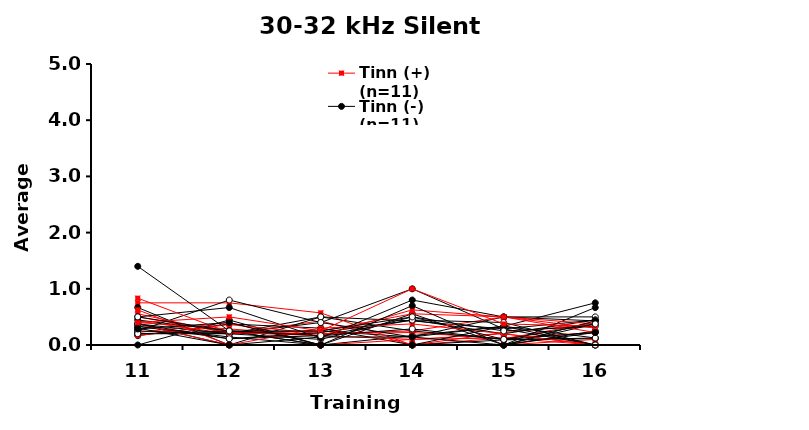
| Category | Tinn (+) (n=11) | Tinn (-) (n=11) | Ctrl (n=8) | CI03 | CI04 | CI05 | CI06 | CI07 | CI08 | CI09 | CI10 | DS18 | CI11 | CI12 | DS19 | CI13 | CI14 | DS20 | CI15 | CI16 | DS21 | CI17 | CI18 | DS22 | CI19 | CI20 | DS23 | CI21 | CI22 | DS24 |
|---|---|---|---|---|---|---|---|---|---|---|---|---|---|---|---|---|---|---|---|---|---|---|---|---|---|---|---|---|---|---|
| 11.0 | 0.556 | 0.333 | 0.2 | 0.167 | 0.2 | 0.75 | 0.222 | 0.4 | 0 | 0.5 | 0.667 | 0.333 | 0.375 | 0.429 | 0.375 | 0.444 | 0.375 | 0.25 | 0.625 | 0.167 | 0.25 | 1.4 | 0.5 | 0.375 | 0.3 | 0.833 | 0.2 | 0.286 | 0.4 | 0.5 |
| 12.0 | 0.2 | 0.143 | 0.222 | 0.375 | 0.2 | 0.75 | 0.4 | 0.286 | 0.444 | 0.222 | 0 | 0.111 | 0 | 0.2 | 0.2 | 0.25 | 0 | 0.2 | 0 | 0.364 | 0.8 | 0.25 | 0.667 | 0.111 | 0 | 0.222 | 0.25 | 0.4 | 0.5 | 0.25 |
| 13.0 | 0.429 | 0 | 0.25 | 0.3 | 0.4 | 0.571 | 0 | 0.167 | 0 | 0.2 | 0.5 | 0.167 | 0 | 0.25 | 0.1 | 0 | 0 | 0.5 | 0.3 | 0.2 | 0.4 | 0 | 0.125 | 0.222 | 0.143 | 0.167 | 0.25 | 0 | 0.25 | 0.167 |
| 14.0 | 0 | 0.167 | 0.143 | 0 | 1 | 0 | 0.1 | 0.1 | 0 | 0.222 | 0.25 | 0.444 | 0.556 | 0.556 | 0.5 | 0 | 0 | 0.429 | 0.375 | 0.25 | 0.143 | 0 | 0.8 | 0.444 | 0.143 | 0.625 | 0.5 | 0.7 | 1 | 0.286 |
| 15.0 | 0.125 | 0.333 | 0.5 | 0 | 0.286 | 0.222 | 0.125 | 0.2 | 0.091 | 0.111 | 0.1 | 0.2 | 0 | 0.5 | 0.1 | 0 | 0 | 0.286 | 0.2 | 0.5 | 0.333 | 0.333 | 0.5 | 0.4 | 0 | 0.5 | 0.25 | 0 | 0.375 | 0.1 |
| 16.0 | 0.222 | 0.75 | 0.5 | 0.375 | 0.444 | 0.375 | 0 | 0 | 0.125 | 0.4 | 0.222 | 0.444 | 0.25 | 0.3 | 0.111 | 0.667 | 0.1 | 0 | 0 | 0.222 | 0.125 | 0 | 0.429 | 0 | 0.222 | 0.375 | 0.333 | 0.429 | 0.333 | 0.375 |